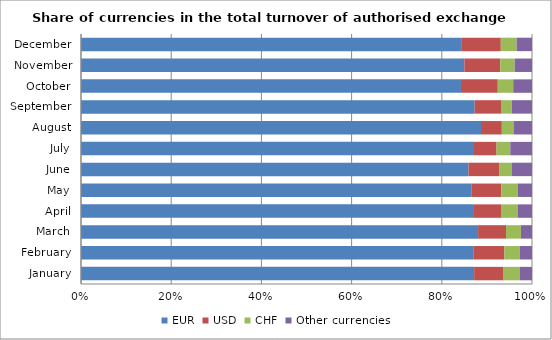
| Category | EUR | USD | CHF | Other currencies |
|---|---|---|---|---|
| January | 0.872 | 0.065 | 0.035 | 0.028 |
| February | 0.87 | 0.069 | 0.034 | 0.027 |
| March | 0.881 | 0.062 | 0.033 | 0.025 |
| April | 0.869 | 0.063 | 0.035 | 0.032 |
| May | 0.865 | 0.067 | 0.036 | 0.032 |
| June | 0.859 | 0.069 | 0.027 | 0.045 |
| July | 0.871 | 0.05 | 0.03 | 0.048 |
| August | 0.887 | 0.046 | 0.026 | 0.041 |
| September | 0.873 | 0.058 | 0.024 | 0.045 |
| October | 0.843 | 0.082 | 0.034 | 0.042 |
| November | 0.85 | 0.08 | 0.032 | 0.038 |
| December | 0.843 | 0.088 | 0.035 | 0.034 |